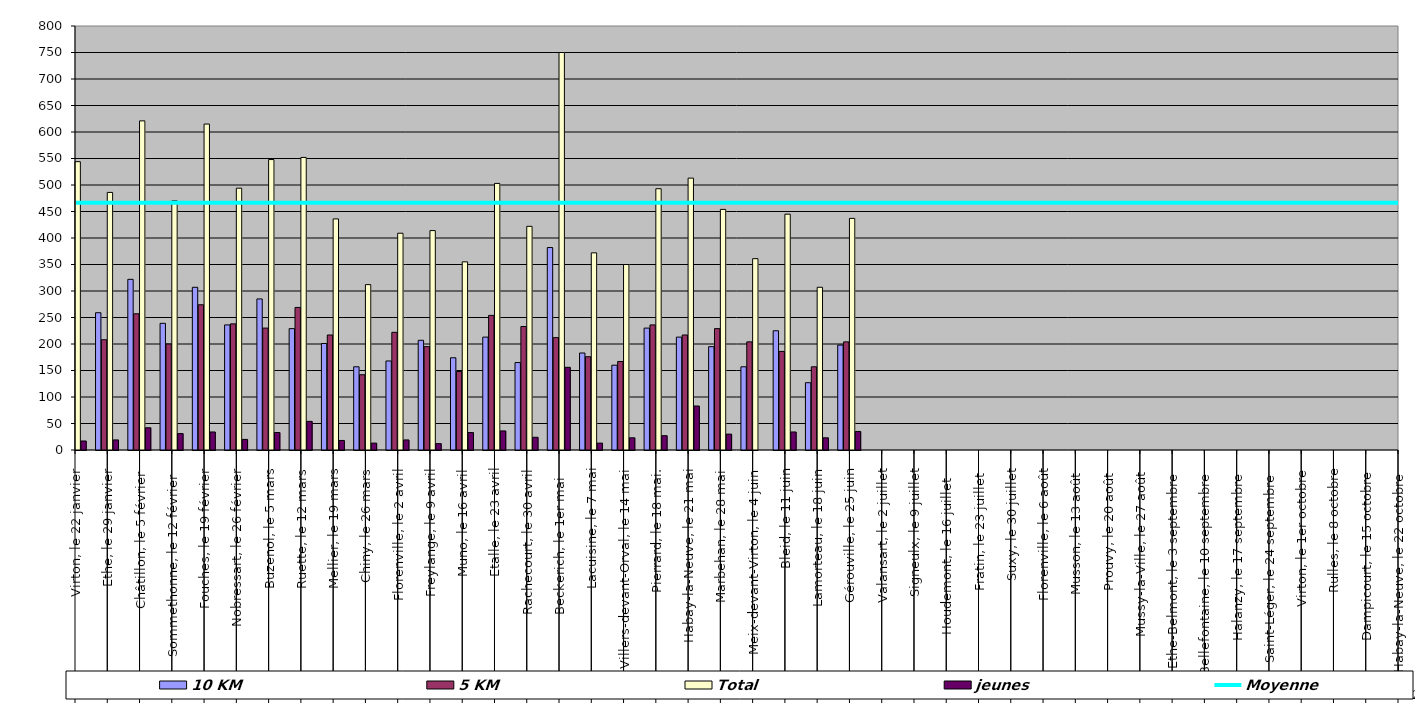
| Category | 10 KM | 5 KM | Total | jeunes |
|---|---|---|---|---|
| 0 | 296 | 231 | 544 | 17 |
| 1 | 259 | 208 | 486 | 19 |
| 2 | 322 | 257 | 621 | 42 |
| 3 | 239 | 200 | 470 | 31 |
| 4 | 307 | 274 | 615 | 34 |
| 5 | 236 | 238 | 494 | 20 |
| 6 | 285 | 230 | 548 | 33 |
| 7 | 229 | 269 | 552 | 54 |
| 8 | 201 | 217 | 436 | 18 |
| 9 | 157 | 142 | 312 | 13 |
| 10 | 168 | 222 | 409 | 19 |
| 11 | 207 | 195 | 414 | 12 |
| 12 | 174 | 148 | 355 | 33 |
| 13 | 213 | 254 | 503 | 36 |
| 14 | 165 | 233 | 422 | 24 |
| 15 | 382 | 212 | 750 | 156 |
| 16 | 183 | 176 | 372 | 13 |
| 17 | 160 | 167 | 350 | 23 |
| 18 | 230 | 236 | 493 | 27 |
| 19 | 213 | 217 | 513 | 83 |
| 20 | 195 | 229 | 454 | 30 |
| 21 | 157 | 204 | 361 | 0 |
| 22 | 225 | 186 | 445 | 34 |
| 23 | 127 | 157 | 307 | 23 |
| 24 | 198 | 204 | 437 | 35 |
| 25 | 0 | 0 | 0 | 0 |
| 26 | 0 | 0 | 0 | 0 |
| 27 | 0 | 0 | 0 | 0 |
| 28 | 0 | 0 | 0 | 0 |
| 29 | 0 | 0 | 0 | 0 |
| 30 | 0 | 0 | 0 | 0 |
| 31 | 0 | 0 | 0 | 0 |
| 32 | 0 | 0 | 0 | 0 |
| 33 | 0 | 0 | 0 | 0 |
| 34 | 0 | 0 | 0 | 0 |
| 35 | 0 | 0 | 0 | 0 |
| 36 | 0 | 0 | 0 | 0 |
| 37 | 0 | 0 | 0 | 0 |
| 38 | 0 | 0 | 0 | 0 |
| 39 | 0 | 0 | 0 | 0 |
| 40 | 0 | 0 | 0 | 0 |
| 41 | 0 | 0 | 0 | 0 |